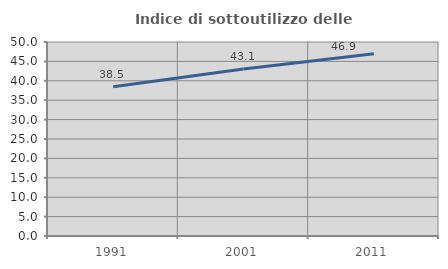
| Category | Indice di sottoutilizzo delle abitazioni  |
|---|---|
| 1991.0 | 38.473 |
| 2001.0 | 43.061 |
| 2011.0 | 46.947 |